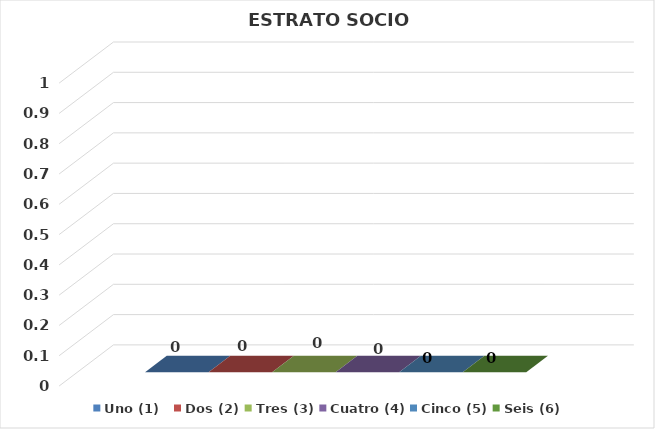
| Category | Uno (1)   | Dos (2) | Tres (3) | Cuatro (4) | Cinco (5) | Seis (6) |
|---|---|---|---|---|---|---|
| 0 | 0 | 0 | 0 | 0 | 0 | 0 |